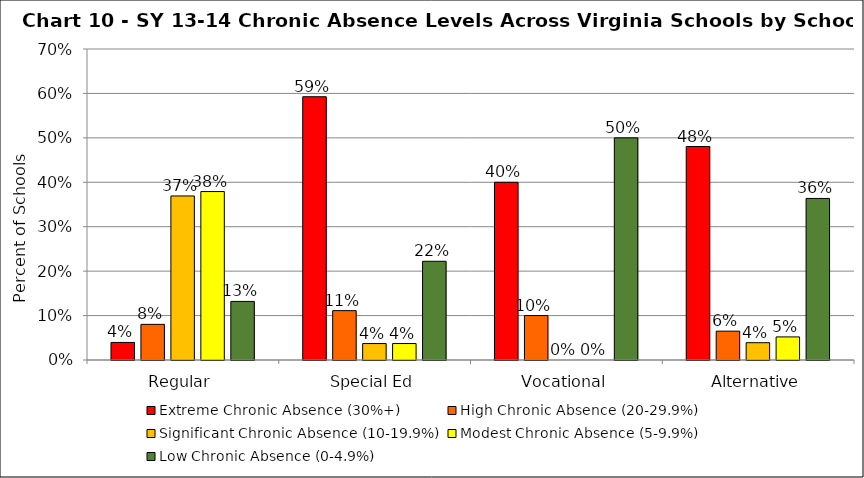
| Category | Extreme Chronic Absence (30%+) | High Chronic Absence (20-29.9%) | Significant Chronic Absence (10-19.9%) | Modest Chronic Absence (5-9.9%) | Low Chronic Absence (0-4.9%) |
|---|---|---|---|---|---|
| 0 | 0.04 | 0.08 | 0.369 | 0.379 | 0.132 |
| 1 | 0.593 | 0.111 | 0.037 | 0.037 | 0.222 |
| 2 | 0.4 | 0.1 | 0 | 0 | 0.5 |
| 3 | 0.481 | 0.065 | 0.039 | 0.052 | 0.364 |